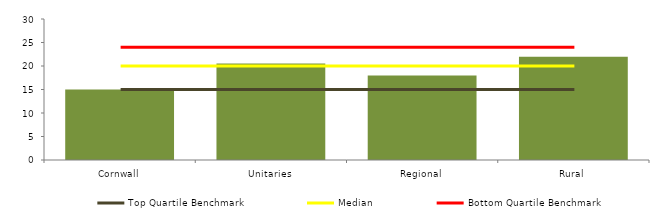
| Category | Block Data |
|---|---|
| Cornwall | 15 |
| Unitaries | 20.526 |
| Regional | 18 |
|  Rural  | 21.952 |